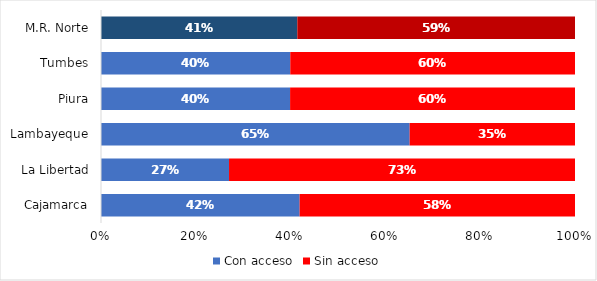
| Category | Con acceso | Sin acceso |
|---|---|---|
| Cajamarca | 337.846 | 468.36 |
| La Libertad | 263.158 | 711.117 |
| Lambayeque | 419.902 | 224.917 |
| Piura | 379.312 | 571.478 |
| Tumbes | 52.315 | 78.697 |
| M.R. Norte | 1452.533 | 2054.569 |